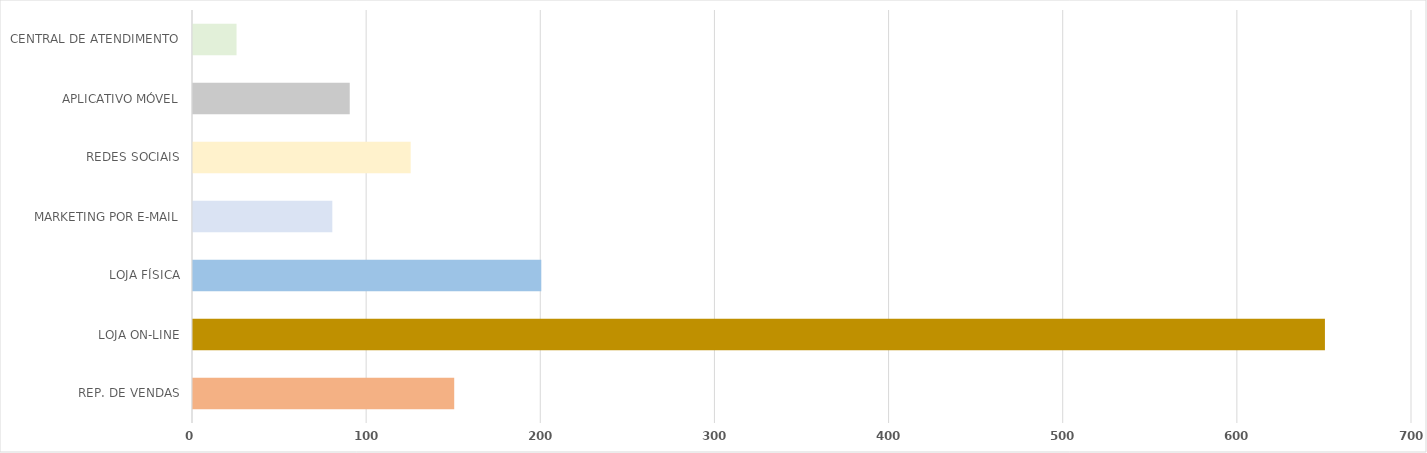
| Category | Series 0 |
|---|---|
| REP. DE VENDAS | 150 |
| LOJA ON-LINE | 650 |
| LOJA FÍSICA | 200 |
| MARKETING POR E-MAIL | 80 |
| REDES SOCIAIS | 125 |
| APLICATIVO MÓVEL | 90 |
| CENTRAL DE ATENDIMENTO | 25 |